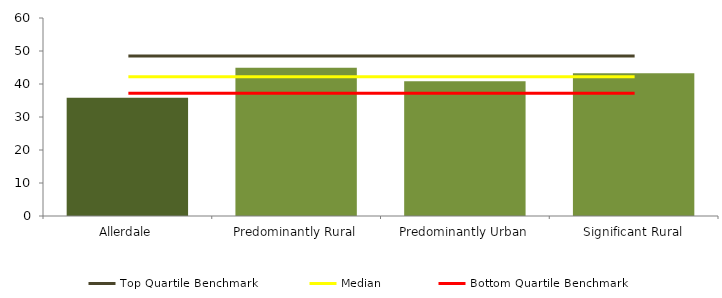
| Category | Series 0 |
|---|---|
| Allerdale | 35.8 |
| Predominantly Rural | 44.891 |
| Predominantly Urban | 40.812 |
| Significant Rural | 43.247 |